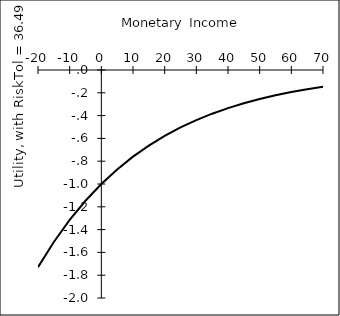
| Category | Series 1 |
|---|---|
| -20.0 | -1.73 |
| -15.0 | -1.508 |
| -10.0 | -1.315 |
| -5.0 | -1.147 |
| 0.0 | -1 |
| 5.0 | -0.872 |
| 10.0 | -0.76 |
| 15.0 | -0.663 |
| 20.0 | -0.578 |
| 25.0 | -0.504 |
| 30.0 | -0.439 |
| 35.0 | -0.383 |
| 40.0 | -0.334 |
| 45.0 | -0.291 |
| 50.0 | -0.254 |
| 55.0 | -0.222 |
| 60.0 | -0.193 |
| 65.0 | -0.168 |
| 70.0 | -0.147 |